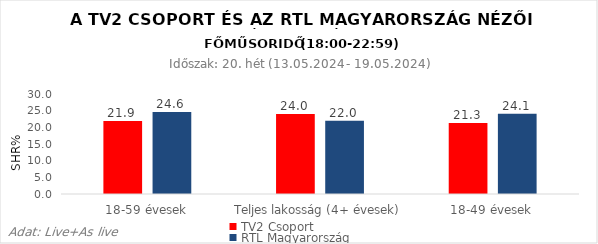
| Category | TV2 Csoport | RTL Magyarország |
|---|---|---|
| 18-59 évesek | 21.9 | 24.6 |
| Teljes lakosság (4+ évesek) | 24 | 22 |
| 18-49 évesek | 21.3 | 24.1 |